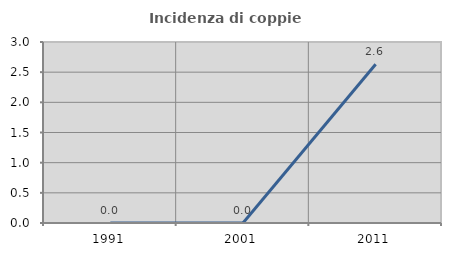
| Category | Incidenza di coppie miste |
|---|---|
| 1991.0 | 0 |
| 2001.0 | 0 |
| 2011.0 | 2.632 |